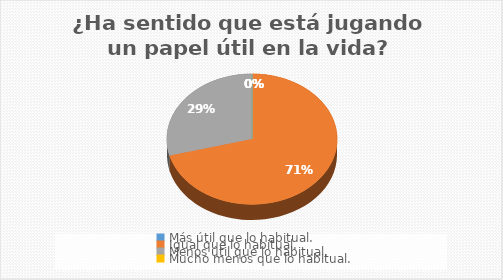
| Category | ¿Ha sentido que está jugando un papel útil en la vida? |
|---|---|
| Más útil que lo habitual. | 0 |
| Igual que lo habitual. | 78 |
| Menos útil que lo habitual. | 32 |
| Mucho menos que lo habitual. | 0 |